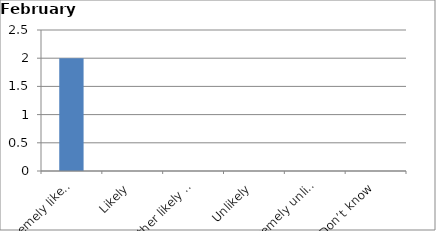
| Category | Series 0 |
|---|---|
| Extremely likely | 2 |
| Likely | 0 |
| Neither likely nor unlikely | 0 |
| Unlikely | 0 |
| Extremely unlikely | 0 |
| Don’t know | 0 |